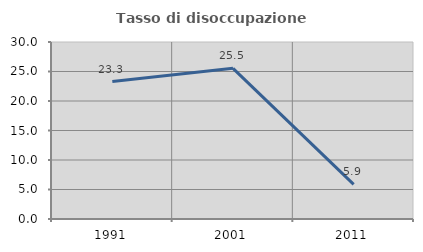
| Category | Tasso di disoccupazione giovanile  |
|---|---|
| 1991.0 | 23.301 |
| 2001.0 | 25.532 |
| 2011.0 | 5.882 |